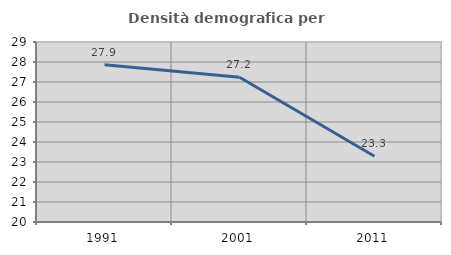
| Category | Densità demografica |
|---|---|
| 1991.0 | 27.862 |
| 2001.0 | 27.238 |
| 2011.0 | 23.287 |